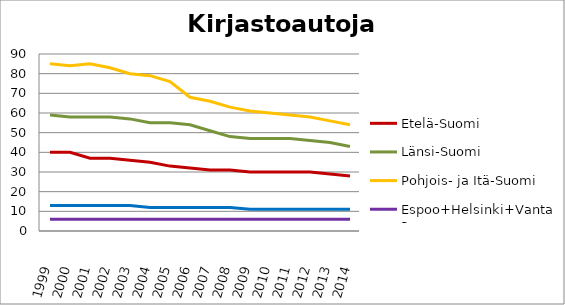
| Category | Etelä-Suomi | Länsi-Suomi | Pohjois- ja Itä-Suomi | Espoo+Helsinki+Vantaa | Muu Uusimaa |
|---|---|---|---|---|---|
| 1999.0 | 40 | 59 | 85 | 6 | 13 |
| 2000.0 | 40 | 58 | 84 | 6 | 13 |
| 2001.0 | 37 | 58 | 85 | 6 | 13 |
| 2002.0 | 37 | 58 | 83 | 6 | 13 |
| 2003.0 | 36 | 57 | 80 | 6 | 13 |
| 2004.0 | 35 | 55 | 79 | 6 | 12 |
| 2005.0 | 33 | 55 | 76 | 6 | 12 |
| 2006.0 | 32 | 54 | 68 | 6 | 12 |
| 2007.0 | 31 | 51 | 66 | 6 | 12 |
| 2008.0 | 31 | 48 | 63 | 6 | 12 |
| 2009.0 | 30 | 47 | 61 | 6 | 11 |
| 2010.0 | 30 | 47 | 60 | 6 | 11 |
| 2011.0 | 30 | 47 | 59 | 6 | 11 |
| 2012.0 | 30 | 46 | 58 | 6 | 11 |
| 2013.0 | 29 | 45 | 56 | 6 | 11 |
| 2014.0 | 28 | 43 | 54 | 6 | 11 |